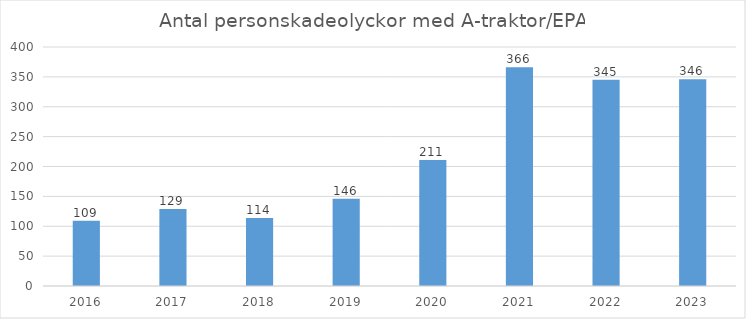
| Category | Series 0 |
|---|---|
| 2016.0 | 109 |
| 2017.0 | 129 |
| 2018.0 | 114 |
| 2019.0 | 146 |
| 2020.0 | 211 |
| 2021.0 | 366 |
| 2022.0 | 345 |
| 2023.0 | 346 |